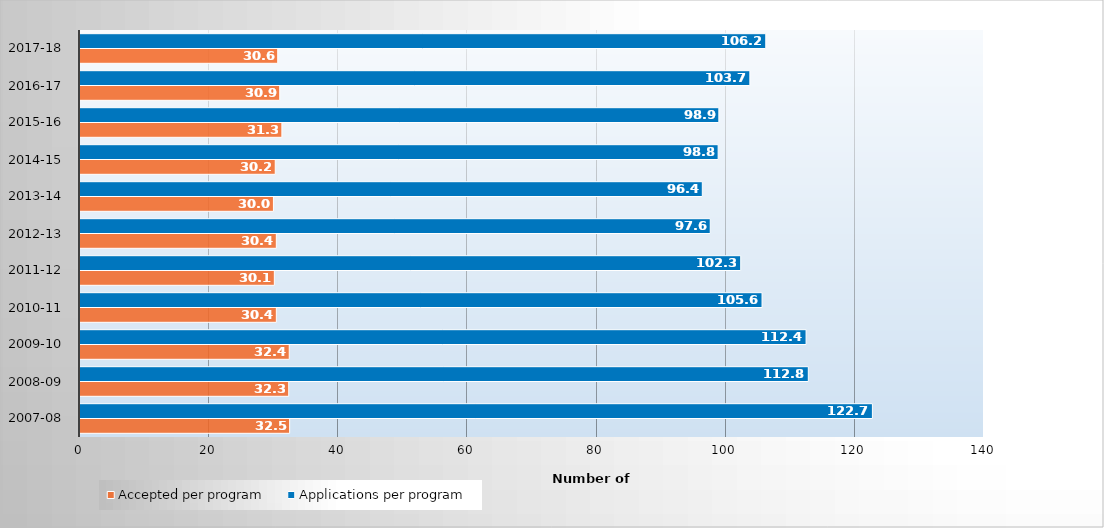
| Category | Accepted per program | Applications per program |
|---|---|---|
| 2007-08 | 32.468 | 122.717 |
| 2008-09 | 32.326 | 112.791 |
| 2009-10 | 32.405 | 112.443 |
| 2010-11 | 30.406 | 105.625 |
| 2011-12 | 30.096 | 102.325 |
| 2012-13 | 30.403 | 97.603 |
| 2013-14 | 29.955 | 96.374 |
| 2014-15 | 30.236 | 98.827 |
| 2015-16 | 31.266 | 98.937 |
| 2016-17 | 30.93 | 103.739 |
| 2017-18 | 30.62 | 106.204 |